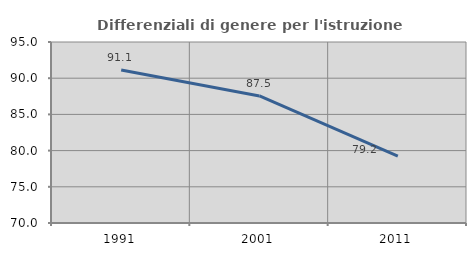
| Category | Differenziali di genere per l'istruzione superiore |
|---|---|
| 1991.0 | 91.125 |
| 2001.0 | 87.549 |
| 2011.0 | 79.245 |